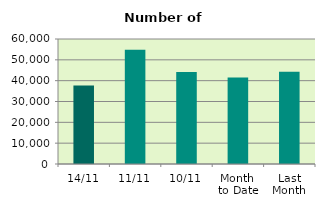
| Category | Series 0 |
|---|---|
| 14/11 | 37634 |
| 11/11 | 54782 |
| 10/11 | 44194 |
| Month 
to Date | 41534.8 |
| Last
Month | 44266.476 |